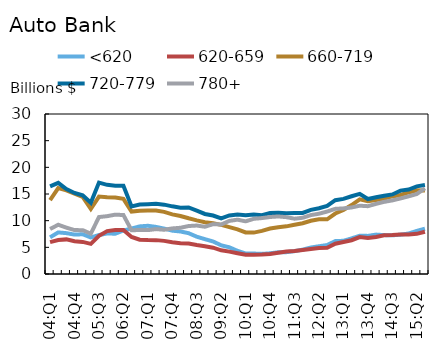
| Category | <620 | 620-659 | 660-719 | 720-779 | 780+ |
|---|---|---|---|---|---|
| 04:Q1 | 6.879 | 5.977 | 13.866 | 16.431 | 8.431 |
| 04:Q2 | 7.795 | 6.362 | 16.11 | 17.1 | 9.235 |
| 04:Q3 | 7.659 | 6.489 | 15.688 | 15.923 | 8.693 |
| 04:Q4 | 7.39 | 6.142 | 15.082 | 15.199 | 8.234 |
| 05:Q1 | 7.452 | 6.02 | 14.444 | 14.748 | 8.218 |
| 05:Q2 | 6.853 | 5.657 | 12.184 | 13.343 | 7.56 |
| 05:Q3 | 7.306 | 7.169 | 14.507 | 17.144 | 10.678 |
| 05:Q4 | 7.595 | 8.051 | 14.383 | 16.717 | 10.841 |
| 06:Q1 | 7.555 | 8.248 | 14.336 | 16.549 | 11.129 |
| 06:Q2 | 8.153 | 8.26 | 14.087 | 16.558 | 11.052 |
| 06:Q3 | 8.526 | 6.944 | 11.71 | 12.669 | 8.191 |
| 06:Q4 | 8.927 | 6.422 | 11.852 | 13.032 | 8.26 |
| 07:Q1 | 9.043 | 6.355 | 11.883 | 13.092 | 8.229 |
| 07:Q2 | 8.83 | 6.35 | 11.903 | 13.153 | 8.418 |
| 07:Q3 | 8.509 | 6.212 | 11.646 | 13.001 | 8.296 |
| 07:Q4 | 8.126 | 5.942 | 11.175 | 12.687 | 8.547 |
| 08:Q1 | 7.97 | 5.768 | 10.872 | 12.428 | 8.667 |
| 08:Q2 | 7.654 | 5.702 | 10.445 | 12.47 | 8.994 |
| 08:Q3 | 6.991 | 5.421 | 10.063 | 11.875 | 9.085 |
| 08:Q4 | 6.531 | 5.214 | 9.72 | 11.259 | 8.859 |
| 09:Q1 | 6.099 | 4.939 | 9.522 | 10.966 | 9.343 |
| 09:Q2 | 5.383 | 4.443 | 9.208 | 10.431 | 9.282 |
| 09:Q3 | 5.006 | 4.195 | 8.797 | 10.986 | 9.957 |
| 09:Q4 | 4.341 | 3.886 | 8.379 | 11.15 | 10.184 |
| 10:Q1 | 3.838 | 3.593 | 7.79 | 11.018 | 9.874 |
| 10:Q2 | 3.834 | 3.617 | 7.759 | 11.147 | 10.35 |
| 10:Q3 | 3.771 | 3.662 | 8.077 | 11.017 | 10.486 |
| 10:Q4 | 3.88 | 3.755 | 8.526 | 11.438 | 10.687 |
| 11:Q1 | 4.075 | 3.984 | 8.76 | 11.472 | 10.79 |
| 11:Q2 | 4.096 | 4.224 | 8.934 | 11.378 | 10.657 |
| 11:Q3 | 4.285 | 4.314 | 9.239 | 11.426 | 10.37 |
| 11:Q4 | 4.569 | 4.495 | 9.513 | 11.443 | 10.547 |
| 12:Q1 | 4.966 | 4.673 | 9.986 | 12.034 | 11.045 |
| 12:Q2 | 5.205 | 4.863 | 10.25 | 12.332 | 11.303 |
| 12:Q3 | 5.429 | 4.928 | 10.253 | 12.775 | 11.71 |
| 12:Q4 | 6.173 | 5.674 | 11.337 | 13.842 | 12.215 |
| 13:Q1 | 6.225 | 5.995 | 12.019 | 14.087 | 12.299 |
| 13:Q2 | 6.675 | 6.332 | 12.919 | 14.577 | 12.476 |
| 13:Q3 | 7.176 | 6.915 | 13.989 | 15.031 | 12.804 |
| 13:Q4 | 7.144 | 6.756 | 13.632 | 14.058 | 12.715 |
| 14:Q1 | 7.386 | 6.956 | 13.859 | 14.392 | 13.151 |
| 14:Q2 | 7.295 | 7.273 | 14.159 | 14.687 | 13.526 |
| 14:Q3 | 7.252 | 7.303 | 14.548 | 14.917 | 13.8 |
| 14:Q4 | 7.372 | 7.407 | 14.819 | 15.633 | 14.167 |
| 15:Q1 | 7.593 | 7.392 | 15.289 | 15.84 | 14.563 |
| 15:Q2 | 8.079 | 7.527 | 15.7 | 16.432 | 14.995 |
| 15:Q3 | 8.498 | 7.93 | 15.673 | 16.669 | 16.071 |